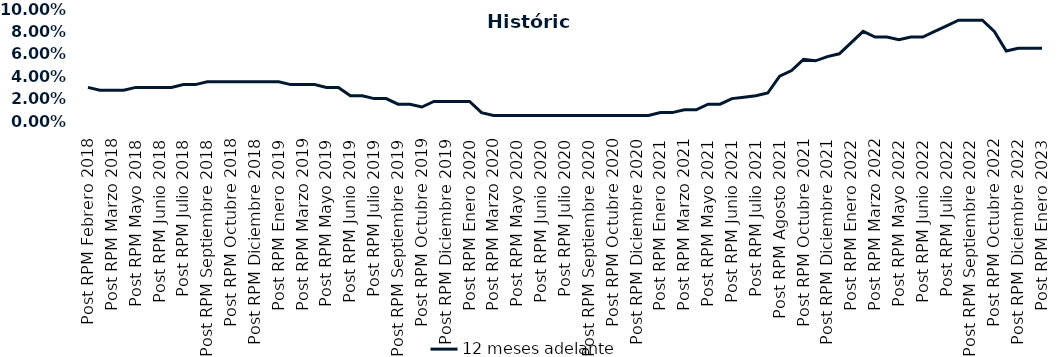
| Category | 12 meses adelante  |
|---|---|
| Post RPM Febrero 2018 | 0.03 |
| Pre RPM Marzo 2018 | 0.028 |
| Post RPM Marzo 2018 | 0.028 |
| Pre RPM Mayo 2018 | 0.028 |
| Post RPM Mayo 2018 | 0.03 |
| Pre RPM Junio 2018 | 0.03 |
| Post RPM Junio 2018 | 0.03 |
| Pre RPM Julio 2018 | 0.03 |
| Post RPM Julio 2018 | 0.032 |
| Pre RPM Septiembre 2018 | 0.032 |
| Post RPM Septiembre 2018 | 0.035 |
| Pre RPM Octubre 2018 | 0.035 |
| Post RPM Octubre 2018 | 0.035 |
| Pre RPM Diciembre 2018 | 0.035 |
| Post RPM Diciembre 2018 | 0.035 |
| Pre RPM Enero 2019 | 0.035 |
| Post RPM Enero 2019 | 0.035 |
| Pre RPM Marzo 2019 | 0.032 |
| Post RPM Marzo 2019 | 0.032 |
| Pre RPM Mayo 2019 | 0.032 |
| Post RPM Mayo 2019 | 0.03 |
| Pre RPM Junio 2019 | 0.03 |
| Post RPM Junio 2019 | 0.022 |
| Pre RPM Julio 2019 | 0.022 |
| Post RPM Julio 2019 | 0.02 |
| Pre RPM Septiembre 2019 | 0.02 |
| Post RPM Septiembre 2019 | 0.015 |
| Pre RPM Octubre 2019 | 0.015 |
| Post RPM Octubre 2019 | 0.012 |
| Pre RPM Diciembre 2019 | 0.018 |
| Post RPM Diciembre 2019 | 0.018 |
| Pre RPM Enero 2020 | 0.018 |
| Post RPM Enero 2020 | 0.018 |
| Pre RPM Marzo 2020 | 0.008 |
| Post RPM Marzo 2020 | 0.005 |
| Pre RPM Mayo 2020 | 0.005 |
| Post RPM Mayo 2020 | 0.005 |
| Pre RPM Junio 2020 | 0.005 |
| Post RPM Junio 2020 | 0.005 |
| Pre RPM Julio 2020 | 0.005 |
| Post RPM Julio 2020 | 0.005 |
| Pre RPM Septiembre 2020 | 0.005 |
| Post RPM Septiembre 2020 | 0.005 |
| Pre RPM Octubre 2020 | 0.005 |
| Post RPM Octubre 2020 | 0.005 |
| Pre RPM Diciembre 2020 | 0.005 |
| Post RPM Diciembre 2020 | 0.005 |
| Pre RPM Enero 2021 | 0.005 |
| Post RPM Enero 2021 | 0.008 |
| Pre RPM Marzo 2021 | 0.008 |
| Post RPM Marzo 2021 | 0.01 |
| Pre RPM Mayo 2021 | 0.01 |
| Post RPM Mayo 2021 | 0.015 |
| Pre RPM Junio 2021 | 0.015 |
| Post RPM Junio 2021 | 0.02 |
| Pre RPM Julio 2021 | 0.021 |
| Post RPM Julio 2021 | 0.022 |
| Pre RPM Agosto 2021 | 0.025 |
| Post RPM Agosto 2021 | 0.04 |
| Pre RPM Octubre 2021 | 0.045 |
| Post RPM Octubre 2021 | 0.055 |
| Pre RPM Diciembre 2021 | 0.054 |
| Post RPM Diciembre 2021 | 0.058 |
| Pre RPM Enero 2022 | 0.06 |
| Post RPM Enero 2022 | 0.07 |
| Pre RPM Marzo 2022 | 0.08 |
| Post RPM Marzo 2022 | 0.075 |
| Pre RPM Mayo 2022 | 0.075 |
| Post RPM Mayo 2022 | 0.072 |
| Pre RPM Junio 2022 | 0.075 |
| Post RPM Junio 2022 | 0.075 |
| Pre RPM Julio 2022 | 0.08 |
| Post RPM Julio 2022 | 0.085 |
| Pre RPM Septiembre 2022 | 0.09 |
| Post RPM Septiembre 2022 | 0.09 |
| Pre RPM Octubre 2022 | 0.09 |
| Post RPM Octubre 2022 | 0.08 |
| Pre RPM Diciembre 2022 | 0.062 |
| Post RPM Diciembre 2022 | 0.065 |
| Pre RPM Enero 2023 | 0.065 |
| Post RPM Enero 2023 | 0.065 |